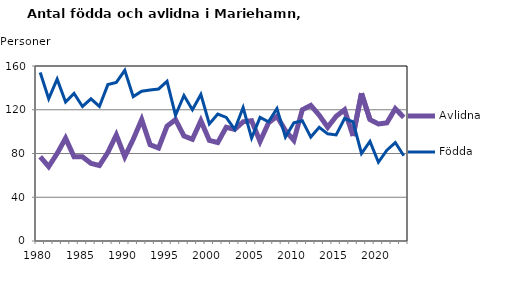
| Category | Avlidna | Födda |
|---|---|---|
| 1980.0 | 77 | 154 |
| 1981.0 | 68 | 130 |
| 1982.0 | 80 | 148 |
| 1983.0 | 94 | 127 |
| 1984.0 | 77 | 135 |
| 1985.0 | 77 | 123 |
| 1986.0 | 71 | 130 |
| 1987.0 | 69 | 123 |
| 1988.0 | 81 | 143 |
| 1989.0 | 97 | 145 |
| 1990.0 | 77 | 156 |
| 1991.0 | 93 | 132 |
| 1992.0 | 111 | 137 |
| 1993.0 | 88 | 138 |
| 1994.0 | 85 | 139 |
| 1995.0 | 105 | 146 |
| 1996.0 | 111 | 115 |
| 1997.0 | 96 | 133 |
| 1998.0 | 93 | 120 |
| 1999.0 | 110 | 134 |
| 2000.0 | 92 | 107 |
| 2001.0 | 90 | 116 |
| 2002.0 | 104 | 113 |
| 2003.0 | 102 | 102 |
| 2004.0 | 109 | 122 |
| 2005.0 | 110 | 94 |
| 2006.0 | 91 | 113 |
| 2007.0 | 108 | 109 |
| 2008.0 | 114 | 121 |
| 2009.0 | 101 | 95 |
| 2010.0 | 92 | 108 |
| 2011.0 | 120 | 110 |
| 2012.0 | 124 | 95 |
| 2013.0 | 115 | 104 |
| 2014.0 | 104 | 98 |
| 2015.0 | 114 | 97 |
| 2016.0 | 120 | 112 |
| 2017.0 | 96 | 109 |
| 2018.0 | 135 | 80 |
| 2019.0 | 111 | 91 |
| 2020.0 | 107 | 72 |
| 2021.0 | 108 | 83 |
| 2022.0 | 121 | 90 |
| 2023.0 | 113 | 78 |